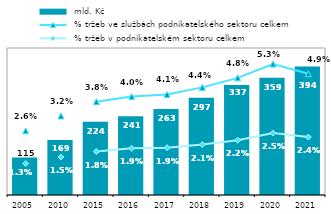
| Category |  mld. Kč |
|---|---|
| 2005.0 | 114.905 |
| 2010.0 | 168.518 |
| 2015.0 | 224.002 |
| 2016.0 | 241.04 |
| 2017.0 | 263.002 |
| 2018.0 | 297.334 |
| 2019.0 | 336.794 |
| 2020.0 | 358.96 |
| 2021.0 | 393.687 |